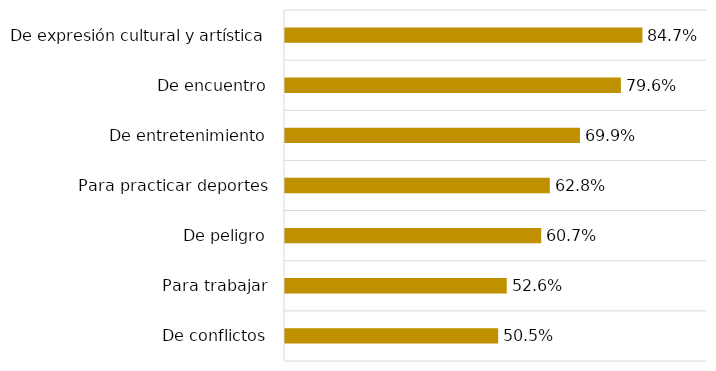
| Category | Series 0 |
|---|---|
| De conflictos | 0.505 |
| Para trabajar | 0.526 |
| De peligro | 0.607 |
| Para practicar deportes | 0.628 |
| De entretenimiento | 0.699 |
| De encuentro | 0.796 |
| De expresión cultural y artística | 0.847 |